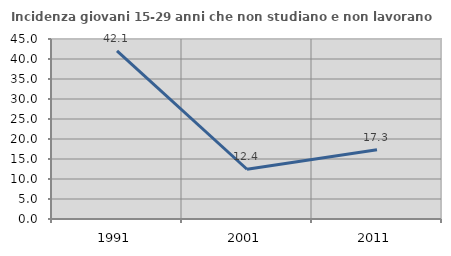
| Category | Incidenza giovani 15-29 anni che non studiano e non lavorano  |
|---|---|
| 1991.0 | 42.056 |
| 2001.0 | 12.434 |
| 2011.0 | 17.326 |